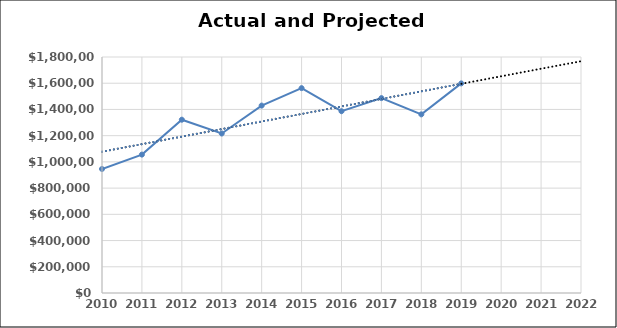
| Category | Series 0 |
|---|---|
| 2010.0 | 946000 |
| 2011.0 | 1055600 |
| 2012.0 | 1321800 |
| 2013.0 | 1216500 |
| 2014.0 | 1429500 |
| 2015.0 | 1562540 |
| 2016.0 | 1386540 |
| 2017.0 | 1486550 |
| 2018.0 | 1362500 |
| 2019.0 | 1598650 |